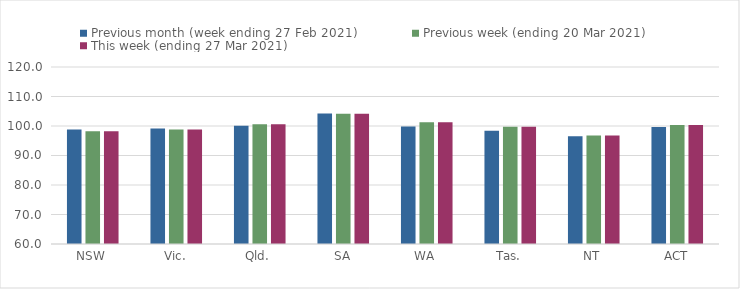
| Category | Previous month (week ending 27 Feb 2021) | Previous week (ending 20 Mar 2021) | This week (ending 27 Mar 2021) |
|---|---|---|---|
| NSW | 98.84 | 98.22 | 98.22 |
| Vic. | 99.17 | 98.81 | 98.81 |
| Qld. | 100.08 | 100.58 | 100.58 |
| SA | 104.21 | 104.17 | 104.17 |
| WA | 99.86 | 101.3 | 101.3 |
| Tas. | 98.37 | 99.76 | 99.76 |
| NT | 96.5 | 96.77 | 96.77 |
| ACT | 99.64 | 100.36 | 100.36 |